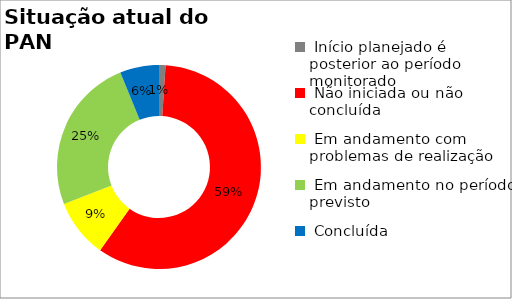
| Category | Series 0 |
|---|---|
|  Início planejado é posterior ao período monitorado | 0.01 |
|  Não iniciada ou não concluída | 0.588 |
|  Em andamento com problemas de realização | 0.093 |
|  Em andamento no período previsto  | 0.247 |
|  Concluída | 0.062 |